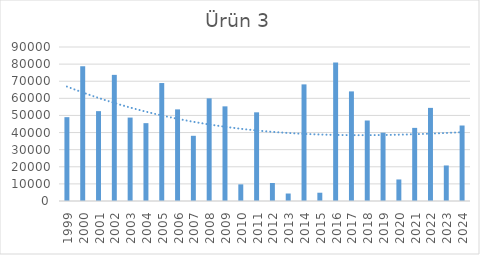
| Category | Ürün 3 |
|---|---|
| 1999.0 | 48996 |
| 2000.0 | 78785 |
| 2001.0 | 52519 |
| 2002.0 | 73715 |
| 2003.0 | 48750 |
| 2004.0 | 45496 |
| 2005.0 | 68940 |
| 2006.0 | 53543 |
| 2007.0 | 38104 |
| 2008.0 | 59991 |
| 2009.0 | 55314 |
| 2010.0 | 9720 |
| 2011.0 | 51824 |
| 2012.0 | 10514 |
| 2013.0 | 4372 |
| 2014.0 | 68156 |
| 2015.0 | 4840 |
| 2016.0 | 80930 |
| 2017.0 | 64050 |
| 2018.0 | 47043 |
| 2019.0 | 39937 |
| 2020.0 | 12586 |
| 2021.0 | 42732 |
| 2022.0 | 54421 |
| 2023.0 | 20768 |
| 2024.0 | 44117 |